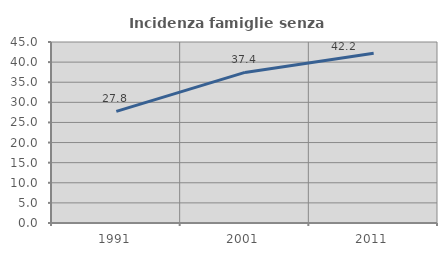
| Category | Incidenza famiglie senza nuclei |
|---|---|
| 1991.0 | 27.757 |
| 2001.0 | 37.433 |
| 2011.0 | 42.176 |